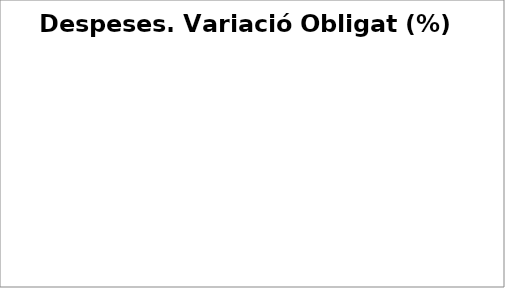
| Category | Series 0 |
|---|---|
| Despeses de personal | 0.009 |
| Despeses en béns corrents i serveis | 0.04 |
| Despeses financeres | -0.272 |
| Transferències corrents | 0.081 |
| Fons de contingència | 0 |
| Inversions reals | 0.447 |
| Transferències de capital | 1.143 |
| Actius financers | 0.661 |
| Passius financers | 0.252 |